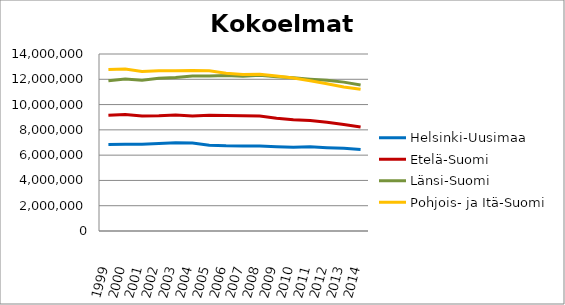
| Category | Helsinki-Uusimaa | Etelä-Suomi | Länsi-Suomi | Pohjois- ja Itä-Suomi |
|---|---|---|---|---|
| 1999.0 | 6842515 | 9146344 | 11884419 | 12765206 |
| 2000.0 | 6852062 | 9206397 | 12031625 | 12807161 |
| 2001.0 | 6868322 | 9087649 | 11922670 | 12616677 |
| 2002.0 | 6919066 | 9107702 | 12073463 | 12674349 |
| 2003.0 | 6987876 | 9167281 | 12144864 | 12672171 |
| 2004.0 | 6954679 | 9101549 | 12266941 | 12701577 |
| 2005.0 | 6784434 | 9160863 | 12252331 | 12681883 |
| 2006.0 | 6734712 | 9142125 | 12292398 | 12483886 |
| 2007.0 | 6729615 | 9110879 | 12249309 | 12388364 |
| 2008.0 | 6714113 | 9088505 | 12315581 | 12389455 |
| 2009.0 | 6659598 | 8923875 | 12210024 | 12262649 |
| 2010.0 | 6632933 | 8806457 | 12120771 | 12094517 |
| 2011.0 | 6660341 | 8743553 | 12010797 | 11881351 |
| 2012.0 | 6593922 | 8604246 | 11923129 | 11642766 |
| 2013.0 | 6545594 | 8430733 | 11774890 | 11397835 |
| 2014.0 | 6443590 | 8231356 | 11546910 | 11205264 |